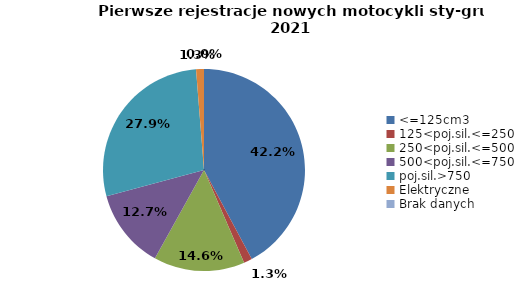
| Category | Series 0 |
|---|---|
| 0 | 9097 |
| 1 | 290 |
| 2 | 3145 |
| 3 | 2748 |
| 4 | 6027 |
| 5 | 272 |
| 6 | 0 |